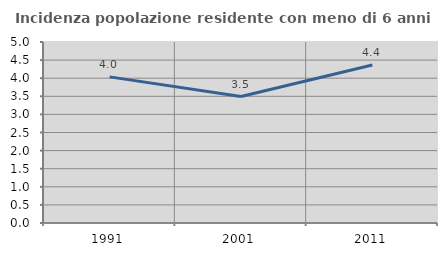
| Category | Incidenza popolazione residente con meno di 6 anni |
|---|---|
| 1991.0 | 4.037 |
| 2001.0 | 3.494 |
| 2011.0 | 4.365 |